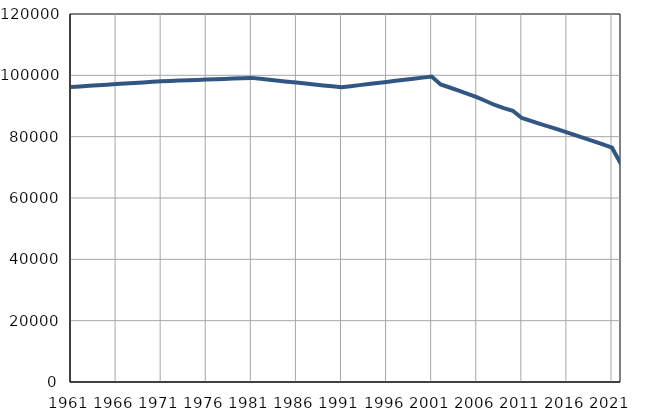
| Category | Population
size |
|---|---|
| 1961.0 | 96191 |
| 1962.0 | 96380 |
| 1963.0 | 96569 |
| 1964.0 | 96758 |
| 1965.0 | 96947 |
| 1966.0 | 97136 |
| 1967.0 | 97324 |
| 1968.0 | 97513 |
| 1969.0 | 97702 |
| 1970.0 | 97891 |
| 1971.0 | 98080 |
| 1972.0 | 98189 |
| 1973.0 | 98298 |
| 1974.0 | 98406 |
| 1975.0 | 98515 |
| 1976.0 | 98624 |
| 1977.0 | 98733 |
| 1978.0 | 98842 |
| 1979.0 | 98950 |
| 1980.0 | 99059 |
| 1981.0 | 99168 |
| 1982.0 | 98862 |
| 1983.0 | 98555 |
| 1984.0 | 98249 |
| 1985.0 | 97943 |
| 1986.0 | 97637 |
| 1987.0 | 97330 |
| 1988.0 | 97024 |
| 1989.0 | 96718 |
| 1990.0 | 96411 |
| 1991.0 | 96105 |
| 1992.0 | 96454 |
| 1993.0 | 96804 |
| 1994.0 | 97153 |
| 1995.0 | 97502 |
| 1996.0 | 97852 |
| 1997.0 | 98202 |
| 1998.0 | 98552 |
| 1999.0 | 98901 |
| 2000.0 | 99250 |
| 2001.0 | 99600 |
| 2002.0 | 97017 |
| 2003.0 | 96028 |
| 2004.0 | 94981 |
| 2005.0 | 93946 |
| 2006.0 | 92887 |
| 2007.0 | 91631 |
| 2008.0 | 90328 |
| 2009.0 | 89314 |
| 2010.0 | 88452 |
| 2011.0 | 86088 |
| 2012.0 | 85127 |
| 2013.0 | 84187 |
| 2014.0 | 83297 |
| 2015.0 | 82389 |
| 2016.0 | 81401 |
| 2017.0 | 80400 |
| 2018.0 | 79437 |
| 2019.0 | 78472 |
| 2020.0 | 77463 |
| 2021.0 | 76393 |
| 2022.0 | 71094 |